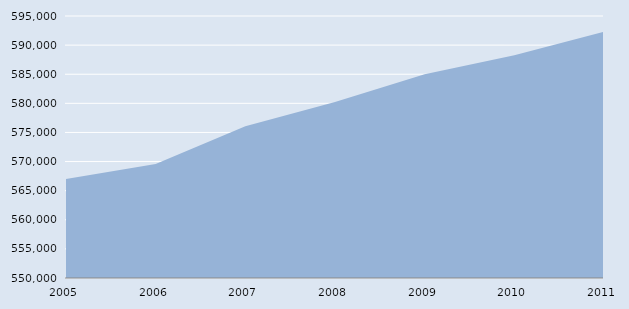
| Category | Series 0 |
|---|---|
| 2005.0 | 567000 |
| 2006.0 | 569600 |
| 2007.0 | 576084 |
| 2008.0 | 580240 |
| 2009.0 | 585000 |
| 2010.0 | 588276 |
| 2011.0 | 592281 |